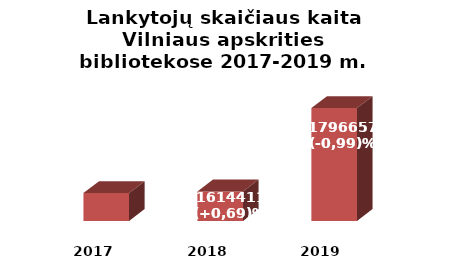
| Category | Series 0 |
|---|---|
| 2017.0 | 1610662 |
| 2018.0 | 1614411 |
| 2019.0 | 1796657 |